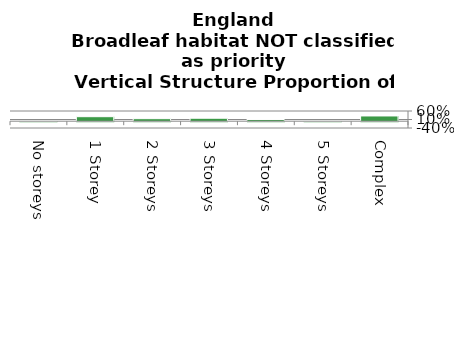
| Category | Broadleaf habitat NOT classified as priority |
|---|---|
| No storeys | 0.002 |
| 1 Storey | 0.265 |
| 2 Storeys | 0.148 |
| 3 Storeys | 0.174 |
| 4 Storeys | 0.099 |
| 5 Storeys | 0.004 |
| Complex | 0.308 |